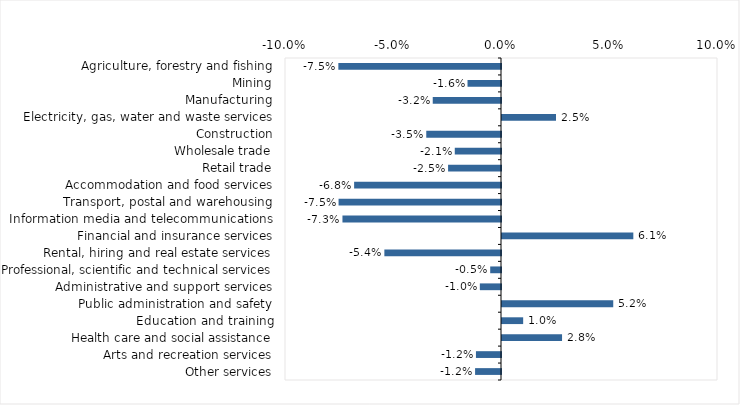
| Category | This week |
|---|---|
| Agriculture, forestry and fishing | -0.075 |
| Mining | -0.016 |
| Manufacturing | -0.032 |
| Electricity, gas, water and waste services | 0.025 |
| Construction | -0.035 |
| Wholesale trade | -0.021 |
| Retail trade | -0.024 |
| Accommodation and food services | -0.068 |
| Transport, postal and warehousing | -0.075 |
| Information media and telecommunications | -0.073 |
| Financial and insurance services | 0.061 |
| Rental, hiring and real estate services | -0.054 |
| Professional, scientific and technical services | -0.005 |
| Administrative and support services | -0.01 |
| Public administration and safety | 0.052 |
| Education and training | 0.01 |
| Health care and social assistance | 0.028 |
| Arts and recreation services | -0.012 |
| Other services | -0.012 |